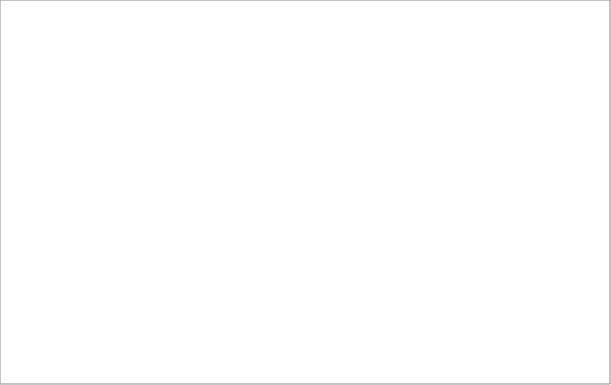
| Category | Sprzedaż  |
|---|---|
| 1 | 1652.612 |
| 2 | 501.627 |
| 3 | 2100.318 |
| 4 | 2375.449 |
| 5 | 2108.154 |
| 6 | 1029.796 |
| 7 | 1579.676 |
| 8 | 590.151 |
| 9 | 1438.848 |
| 10 | 1383.016 |
| 11 | 1556.064 |
| 12 | 1168.167 |
| 13 | 1594.809 |
| 14 | 1317.925 |
| 15 | 1737.496 |
| 16 | 1218.018 |
| 17 | 2027.601 |
| 18 | 992.846 |
| 19 | 745.503 |
| 20 | 2005.984 |
| 21 | 948.221 |
| 22 | 678.228 |
| 23 | 1748.765 |
| 24 | 1602.766 |
| 25 | 1066.189 |
| 26 | 1254.969 |
| 27 | 737.98 |
| 28 | 666.439 |
| 29 | 1593.638 |
| 30 | 1800.67 |
| 31 | 1306.379 |
| 32 | 499.221 |
| 33 | 1483.367 |
| 34 | 875.16 |
| 35 | 932.435 |
| 36 | 873.619 |
| 37 | 798.19 |
| 38 | 1239.757 |
| 39 | 1541.144 |
| 40 | 1015.673 |
| 41 | 1142.787 |
| 42 | 572.302 |
| 43 | 475.269 |
| 44 | 2360.312 |
| 45 | 2666.172 |
| 46 | 2240.321 |
| 47 | 1273.067 |
| 48 | 1372.818 |
| 49 | 1121.034 |
| 50 | 2967.049 |